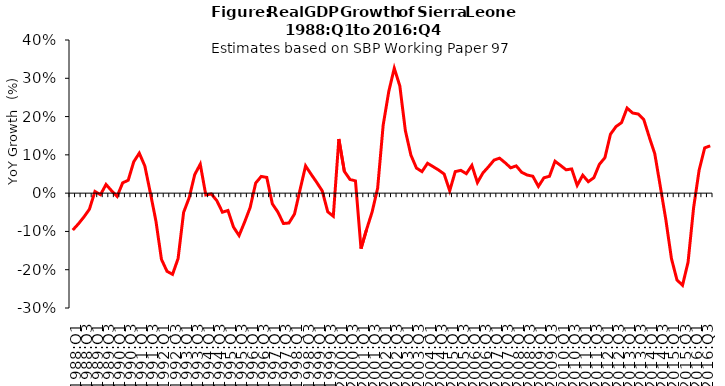
| Category | Series 0 |
|---|---|
| 1988:Q1 | -0.096 |
| 1988:Q2 | -0.08 |
| 1988:Q3 | -0.062 |
| 1988:Q4 | -0.042 |
| 1989:Q1 | 0.004 |
| 1989:Q2 | -0.004 |
| 1989:Q3 | 0.023 |
| 1989:Q4 | 0.006 |
| 1990:Q1 | -0.009 |
| 1990:Q2 | 0.027 |
| 1990:Q3 | 0.034 |
| 1990:Q4 | 0.082 |
| 1991:Q1 | 0.104 |
| 1991:Q2 | 0.071 |
| 1991:Q3 | 0.001 |
| 1991:Q4 | -0.073 |
| 1992:Q1 | -0.173 |
| 1992:Q2 | -0.204 |
| 1992:Q3 | -0.212 |
| 1992:Q4 | -0.171 |
| 1993:Q1 | -0.05 |
| 1993:Q2 | -0.012 |
| 1993:Q3 | 0.048 |
| 1993:Q4 | 0.076 |
| 1994:Q1 | -0.005 |
| 1994:Q2 | -0.002 |
| 1994:Q3 | -0.02 |
| 1994:Q4 | -0.05 |
| 1995:Q1 | -0.045 |
| 1995:Q2 | -0.089 |
| 1995:Q3 | -0.111 |
| 1995:Q4 | -0.076 |
| 1996:Q1 | -0.037 |
| 1996:Q2 | 0.026 |
| 1996:Q3 | 0.044 |
| 1996:Q4 | 0.041 |
| 1997:Q1 | -0.028 |
| 1997:Q2 | -0.049 |
| 1997:Q3 | -0.079 |
| 1997:Q4 | -0.078 |
| 1998:Q1 | -0.054 |
| 1998:Q2 | 0.009 |
| 1998:Q3 | 0.071 |
| 1998:Q4 | 0.049 |
| 1999:Q1 | 0.028 |
| 1999:Q2 | 0.006 |
| 1999:Q3 | -0.049 |
| 1999:Q4 | -0.06 |
| 2000:Q1 | 0.141 |
| 2000:Q2 | 0.057 |
| 2000:Q3 | 0.036 |
| 2000:Q4 | 0.032 |
| 2001:Q1 | -0.145 |
| 2001:Q2 | -0.095 |
| 2001:Q3 | -0.049 |
| 2001:Q4 | 0.013 |
| 2002:Q1 | 0.178 |
| 2002:Q2 | 0.265 |
| 2002:Q3 | 0.326 |
| 2002:Q4 | 0.28 |
| 2003:Q1 | 0.163 |
| 2003:Q2 | 0.099 |
| 2003:Q3 | 0.066 |
| 2003:Q4 | 0.056 |
| 2004:Q1 | 0.078 |
| 2004:Q2 | 0.069 |
| 2004:Q3 | 0.06 |
| 2004:Q4 | 0.05 |
| 2005:Q1 | 0.006 |
| 2005:Q2 | 0.056 |
| 2005:Q3 | 0.06 |
| 2005:Q4 | 0.051 |
| 2006:Q1 | 0.073 |
| 2006:Q2 | 0.028 |
| 2006:Q3 | 0.053 |
| 2006:Q4 | 0.069 |
| 2007:Q1 | 0.086 |
| 2007:Q2 | 0.091 |
| 2007:Q3 | 0.079 |
| 2007:Q4 | 0.066 |
| 2008:Q1 | 0.071 |
| 2008:Q2 | 0.054 |
| 2008:Q3 | 0.047 |
| 2008:Q4 | 0.044 |
| 2009:Q1 | 0.018 |
| 2009:Q2 | 0.04 |
| 2009:Q3 | 0.044 |
| 2009:Q4 | 0.083 |
| 2010:Q1 | 0.072 |
| 2010:Q2 | 0.061 |
| 2010:Q3 | 0.063 |
| 2010:Q4 | 0.02 |
| 2011:Q1 | 0.047 |
| 2011:Q2 | 0.03 |
| 2011:Q3 | 0.04 |
| 2011:Q4 | 0.075 |
| 2012:Q1 | 0.093 |
| 2012:Q2 | 0.154 |
| 2012:Q3 | 0.174 |
| 2012:Q4 | 0.184 |
| 2013:Q1 | 0.222 |
| 2013:Q2 | 0.209 |
| 2013:Q3 | 0.207 |
| 2013:Q4 | 0.193 |
| 2014:Q1 | 0.147 |
| 2014:Q2 | 0.103 |
| 2014:Q3 | 0.017 |
| 2014:Q4 | -0.07 |
| 2015:Q1 | -0.171 |
| 2015:Q2 | -0.227 |
| 2015:Q3 | -0.241 |
| 2015:Q4 | -0.18 |
| 2016:Q1 | -0.038 |
| 2016:Q2 | 0.06 |
| 2016:Q3 | 0.118 |
| 2016:Q4 | 0.124 |